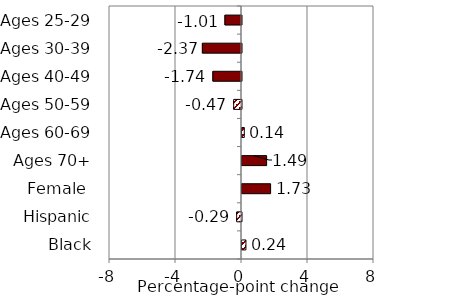
| Category | Series 0 |
|---|---|
| Black | 0.238 |
| Hispanic | -0.293 |
| Female  | 1.733 |
| Ages 70+ | 1.492 |
| Ages 60-69 | 0.14 |
| Ages 50-59 | -0.474 |
| Ages 40-49 | -1.736 |
| Ages 30-39 | -2.371 |
| Ages 25-29 | -1.005 |